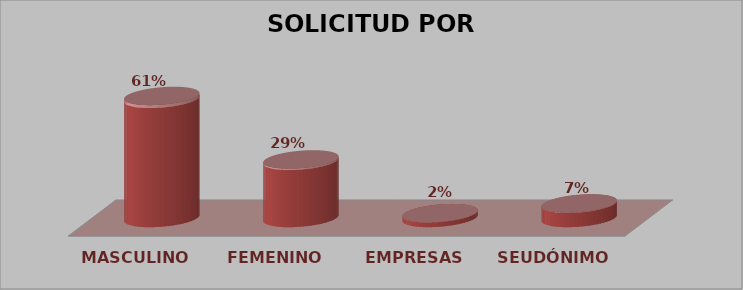
| Category | SOLICITUD POR GÉNERO | Series 1 |
|---|---|---|
| MASCULINO | 25 | 0.61 |
| FEMENINO | 12 | 0.293 |
| EMPRESAS | 1 | 0.024 |
| SEUDÓNIMO | 3 | 0.073 |